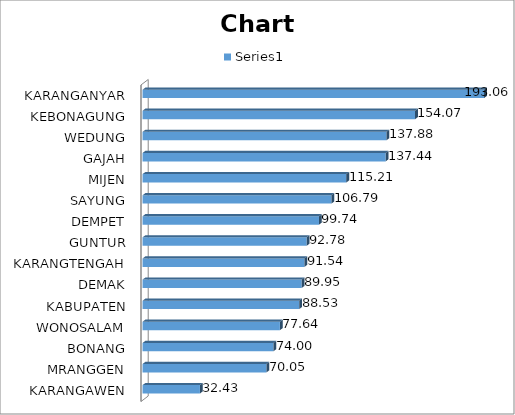
| Category | Series 0 |
|---|---|
| KARANGAWEN | 32.43 |
| MRANGGEN | 70.05 |
| BONANG | 74 |
| WONOSALAM | 77.64 |
| KABUPATEN | 88.53 |
| DEMAK | 89.95 |
| KARANGTENGAH | 91.54 |
| GUNTUR | 92.78 |
| DEMPET | 99.74 |
| SAYUNG | 106.79 |
| MIJEN | 115.21 |
| GAJAH | 137.44 |
| WEDUNG | 137.88 |
| KEBONAGUNG | 154.07 |
| KARANGANYAR | 193.06 |